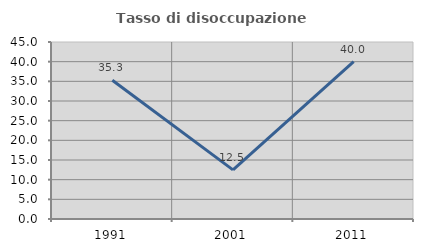
| Category | Tasso di disoccupazione giovanile  |
|---|---|
| 1991.0 | 35.294 |
| 2001.0 | 12.5 |
| 2011.0 | 40 |